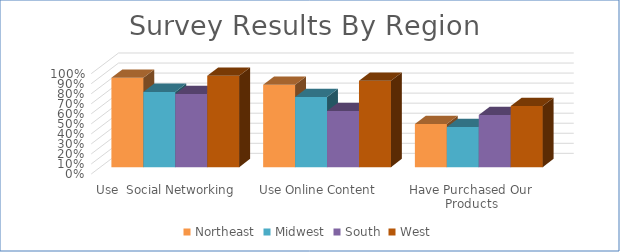
| Category | Northeast | Midwest | South | West |
|---|---|---|---|---|
| Use  Social Networking | 0.89 | 0.75 | 0.73 | 0.91 |
| Use Online Content | 0.82 | 0.7 | 0.56 | 0.86 |
| Have Purchased Our Products | 0.43 | 0.4 | 0.52 | 0.61 |